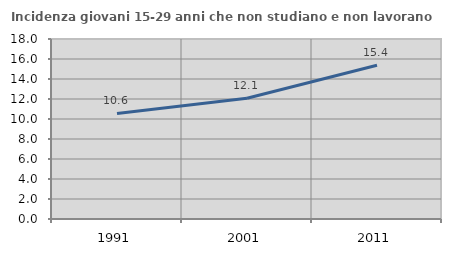
| Category | Incidenza giovani 15-29 anni che non studiano e non lavorano  |
|---|---|
| 1991.0 | 10.558 |
| 2001.0 | 12.077 |
| 2011.0 | 15.375 |